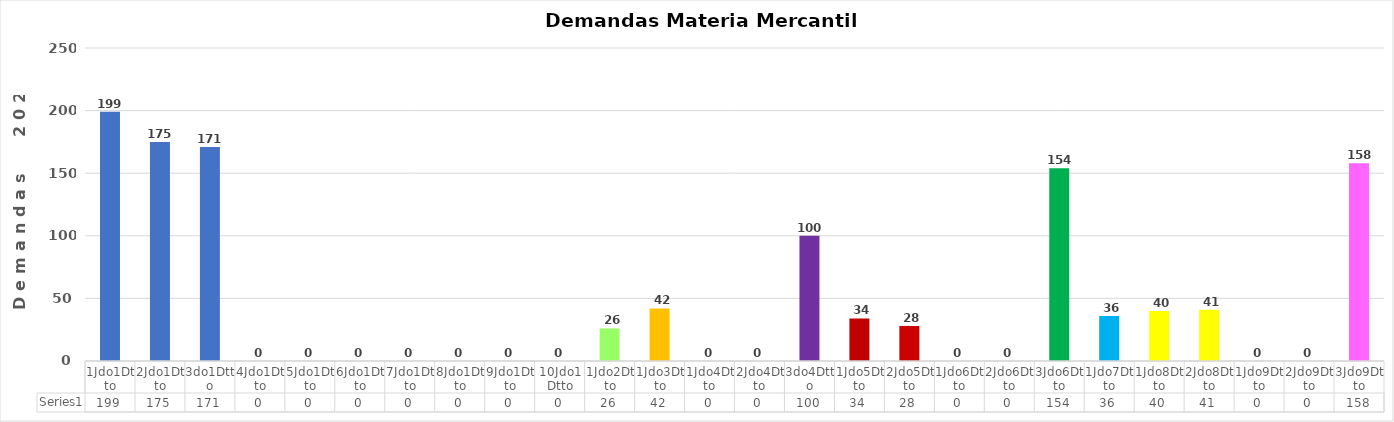
| Category | Series 0 |
|---|---|
| 1Jdo1Dtto | 199 |
| 2Jdo1Dtto | 175 |
| 3do1Dtto | 171 |
| 4Jdo1Dtto | 0 |
| 5Jdo1Dtto | 0 |
| 6Jdo1Dtto | 0 |
| 7Jdo1Dtto | 0 |
| 8Jdo1Dtto | 0 |
| 9Jdo1Dtto | 0 |
| 10Jdo1Dtto | 0 |
| 1Jdo2Dtto | 26 |
| 1Jdo3Dtto | 42 |
| 1Jdo4Dtto | 0 |
| 2Jdo4Dtto | 0 |
| 3do4Dtto | 100 |
| 1Jdo5Dtto | 34 |
| 2Jdo5Dtto | 28 |
| 1Jdo6Dtto | 0 |
| 2Jdo6Dtto | 0 |
| 3Jdo6Dtto | 154 |
| 1Jdo7Dtto | 36 |
| 1Jdo8Dtto | 40 |
| 2Jdo8Dtto | 41 |
| 1Jdo9Dtto | 0 |
| 2Jdo9Dtto | 0 |
| 3Jdo9Dtto | 158 |